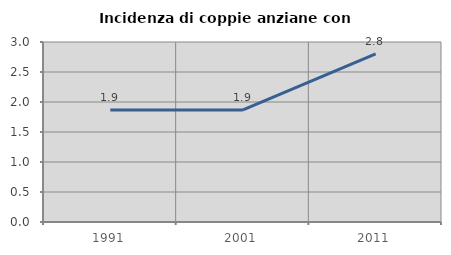
| Category | Incidenza di coppie anziane con figli |
|---|---|
| 1991.0 | 1.868 |
| 2001.0 | 1.867 |
| 2011.0 | 2.802 |